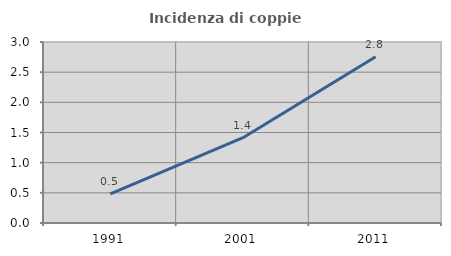
| Category | Incidenza di coppie miste |
|---|---|
| 1991.0 | 0.482 |
| 2001.0 | 1.414 |
| 2011.0 | 2.757 |